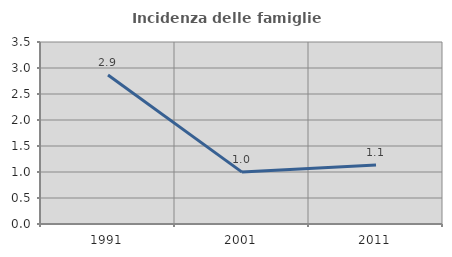
| Category | Incidenza delle famiglie numerose |
|---|---|
| 1991.0 | 2.865 |
| 2001.0 | 0.998 |
| 2011.0 | 1.135 |